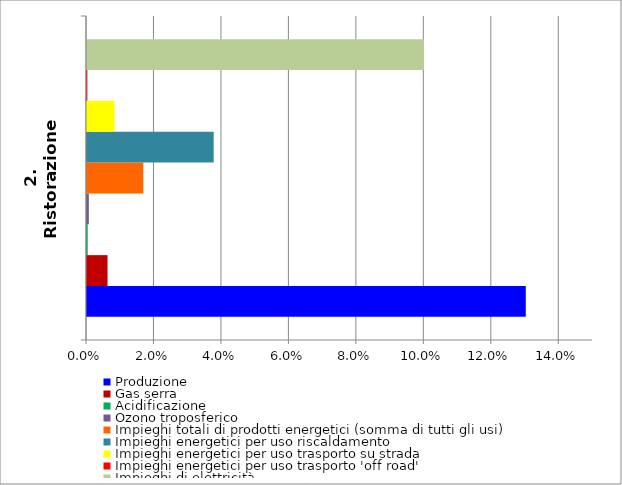
| Category | Produzione | Gas serra | Acidificazione | Ozono troposferico | Impieghi totali di prodotti energetici (somma di tutti gli usi) | Impieghi energetici per uso riscaldamento | Impieghi energetici per uso trasporto su strada | Impieghi energetici per uso trasporto 'off road' | Impieghi di elettricità |
|---|---|---|---|---|---|---|---|---|---|
| 2. Ristorazione | 0.13 | 0.006 | 0 | 0.001 | 0.017 | 0.038 | 0.008 | 0 | 0.1 |